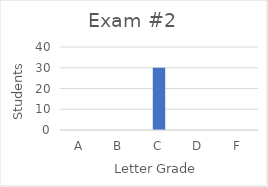
| Category | Series 0 |
|---|---|
| A | 0 |
| B | 0 |
| C | 30 |
| D | 0 |
| F | 0 |